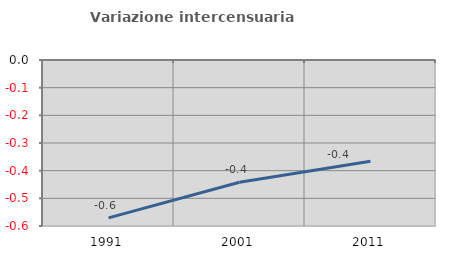
| Category | Variazione intercensuaria annua |
|---|---|
| 1991.0 | -0.571 |
| 2001.0 | -0.442 |
| 2011.0 | -0.366 |